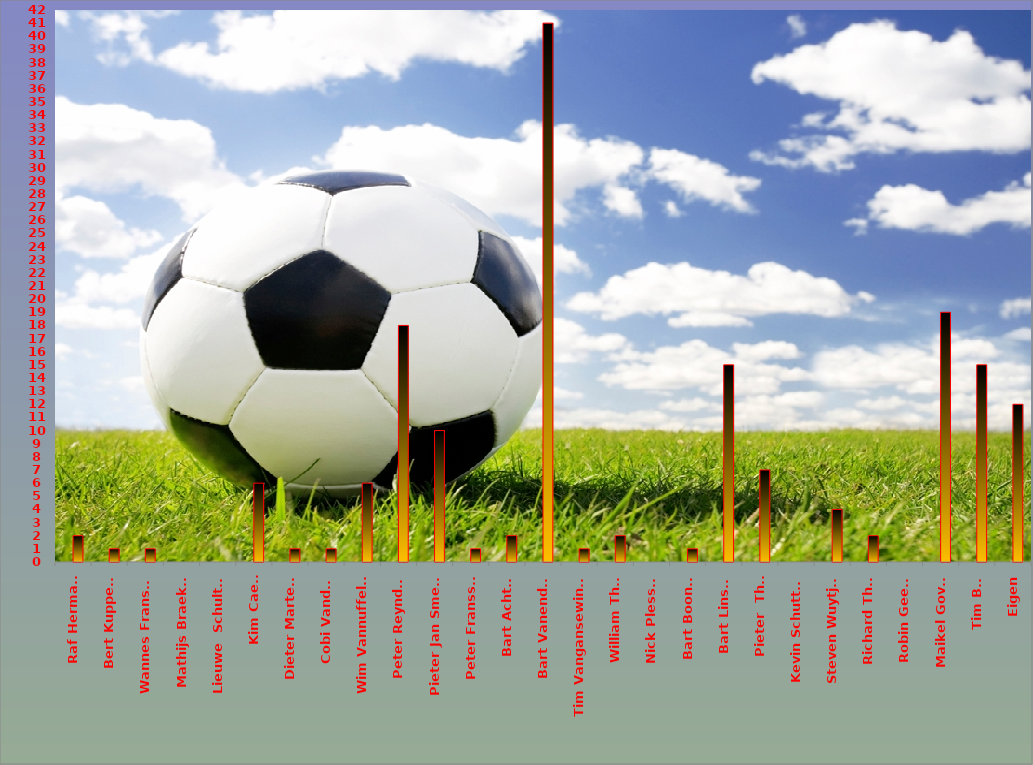
| Category | Series 0 | Series 1 |
|---|---|---|
| Raf Hermans |  | 2 |
| Bert Kuppens |  | 1 |
| Wannes Franssen |  | 1 |
| Mathijs Braeken |  | 0 |
| Lieuwe  Schultink |  | 0 |
| Kim Caels |  | 6 |
| Dieter Martens |  | 1 |
| Cobi Vandael |  | 1 |
| Wim Vannuffelen |  | 6 |
| Peter Reynders |  | 18 |
| Pieter Jan Smeets |  | 10 |
| Peter Franssen |  | 1 |
| Bart Achten |  | 2 |
| Bart Vanendert |  | 41 |
| Tim Vangansewinkel |  | 1 |
| William Thijs |  | 2 |
| Nick Plessers |  | 0 |
| Bart Boonen |  | 1 |
| Bart Linsen |  | 15 |
| Pieter  Thijs |  | 7 |
| Kevin Schutters |  | 0 |
| Steven Wuytjes |  | 4 |
| Richard Thijs |  | 2 |
| Robin Geerts |  | 0 |
| Maikel Goven |  | 19 |
| Tim Bex |  | 15 |
| Eigen |  | 12 |